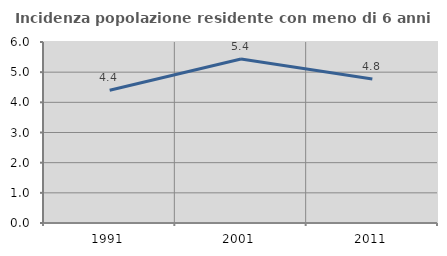
| Category | Incidenza popolazione residente con meno di 6 anni |
|---|---|
| 1991.0 | 4.401 |
| 2001.0 | 5.437 |
| 2011.0 | 4.775 |